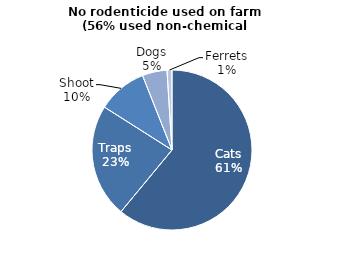
| Category | Series 0 |
|---|---|
| Cats | 61 |
| Traps | 23 |
| Shoot | 10 |
| Dogs | 5 |
| Ferrets | 1 |